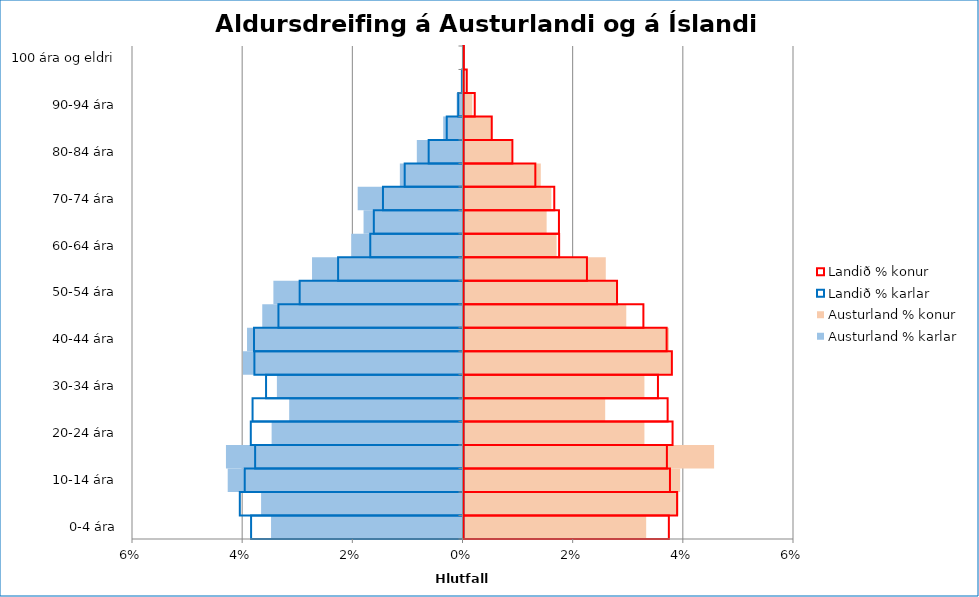
| Category | Austurland | Landið |
|---|---|---|
| 0-4 ára | 0.033 | 0.037 |
| 5-9 ára | 0.039 | 0.039 |
| 10-14 ára | 0.039 | 0.037 |
| 15-19 ára | 0.045 | 0.037 |
| 20-24 ára | 0.033 | 0.038 |
| 25-29 ára | 0.026 | 0.037 |
| 30-34 ára | 0.033 | 0.035 |
| 35-39 ára | 0.038 | 0.038 |
| 40-44 ára | 0.037 | 0.037 |
| 45-49 ára | 0.03 | 0.033 |
| 50-54 ára | 0.028 | 0.028 |
| 55-59 ára | 0.026 | 0.022 |
| 60-64 ára | 0.017 | 0.017 |
| 65-69 ára | 0.015 | 0.017 |
| 70-74 ára | 0.016 | 0.016 |
| 75-79 ára | 0.014 | 0.013 |
| 80-84 ára | 0.009 | 0.009 |
| 85-89 ára | 0.005 | 0.005 |
| 90-94 ára | 0.002 | 0.002 |
| 95-99 ára | 0 | 0.001 |
| 100 ára og eldri | 0 | 0 |